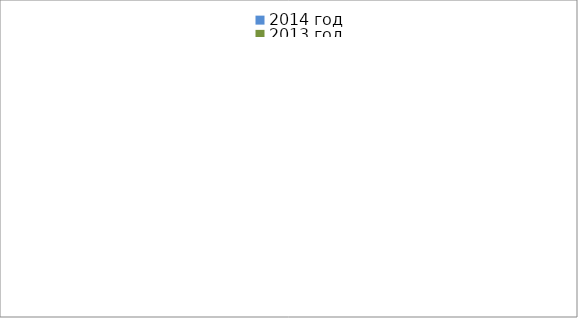
| Category | 2014 год | 2013 год |
|---|---|---|
|  - поджог | 2 | 11 |
|  - неосторожное обращение с огнём | 19 | 13 |
|  - НПТЭ электрооборудования | 3 | 14 |
|  - НПУ и Э печей | 29 | 17 |
|  - НПУ и Э транспортных средств | 30 | 34 |
|   -Шалость с огнем детей | 0 | 2 |
|  -НППБ при эксплуатации эл.приборов | 9 | 14 |
|  - курение | 4 | 4 |
| - прочие | 42 | 29 |
| - не установленные причины | 5 | 1 |